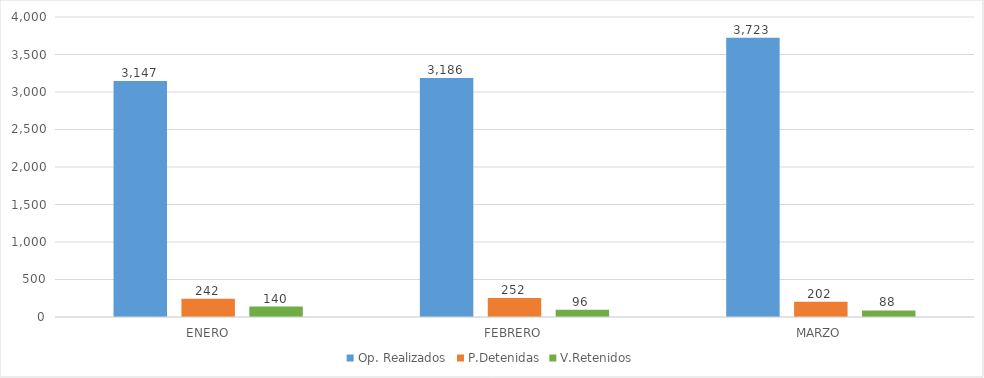
| Category | Op. Realizados | P.Detenidas | V.Retenidos |
|---|---|---|---|
| ENERO | 3147 | 242 | 140 |
| FEBRERO | 3186 | 252 | 96 |
| MARZO | 3723 | 202 | 88 |